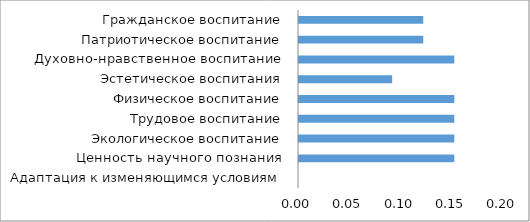
| Category | Series 0 |
|---|---|
| Гражданское воспитание | 0.121 |
| Патриотическое воспитание | 0.121 |
| Духовно-нравственное воспитание | 0.152 |
| Эстетическое воспитания | 0.091 |
| Физическое воспитание | 0.152 |
| Трудовое воспитание | 0.152 |
| Экологическое воспитание | 0.152 |
| Ценность научного познания | 0.152 |
| Адаптация к изменяющимся условиям | 0 |